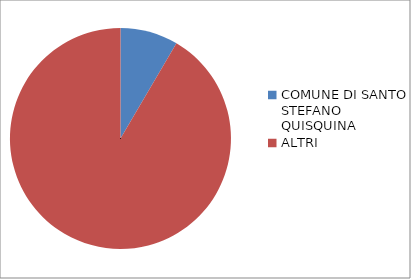
| Category | Series 0 |
|---|---|
| COMUNE DI SANTO STEFANO QUISQUINA | 8.45 |
| ALTRI | 91.55 |